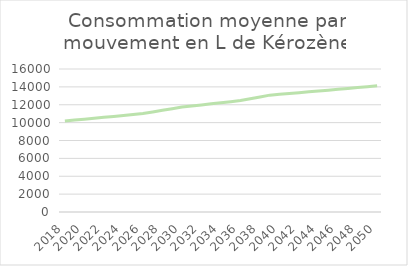
| Category | Consommation moyenne par mouvement en L de Kérozène |
|---|---|
| 2018.0 | 10178.886 |
| 2019.0 | 10280.675 |
| 2020.0 | 10383.482 |
| 2021.0 | 10487.317 |
| 2022.0 | 10592.19 |
| 2023.0 | 10698.112 |
| 2024.0 | 10805.093 |
| 2025.0 | 10913.144 |
| 2026.0 | 11022.275 |
| 2027.0 | 11198.632 |
| 2028.0 | 11377.81 |
| 2029.0 | 11559.855 |
| 2030.0 | 11744.813 |
| 2031.0 | 11862.261 |
| 2032.0 | 11980.883 |
| 2033.0 | 12100.692 |
| 2034.0 | 12221.699 |
| 2035.0 | 12343.916 |
| 2036.0 | 12467.355 |
| 2037.0 | 12666.833 |
| 2038.0 | 12869.502 |
| 2039.0 | 13075.414 |
| 2040.0 | 13166.942 |
| 2041.0 | 13259.111 |
| 2042.0 | 13351.924 |
| 2043.0 | 13445.388 |
| 2044.0 | 13539.506 |
| 2045.0 | 13634.282 |
| 2046.0 | 13729.722 |
| 2047.0 | 13825.83 |
| 2048.0 | 13922.611 |
| 2049.0 | 14020.069 |
| 2050.0 | 14118.21 |